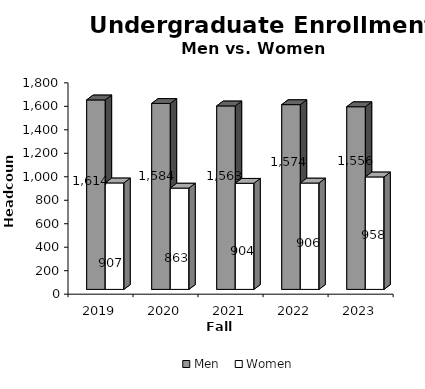
| Category | Men | Women |
|---|---|---|
| 2019.0 | 1614 | 907 |
| 2020.0 | 1584 | 863 |
| 2021.0 | 1563 | 904 |
| 2022.0 | 1574 | 906 |
| 2023.0 | 1556 | 958 |